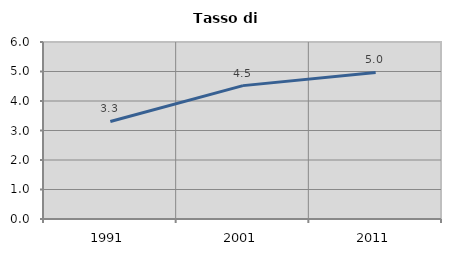
| Category | Tasso di disoccupazione   |
|---|---|
| 1991.0 | 3.306 |
| 2001.0 | 4.521 |
| 2011.0 | 4.968 |